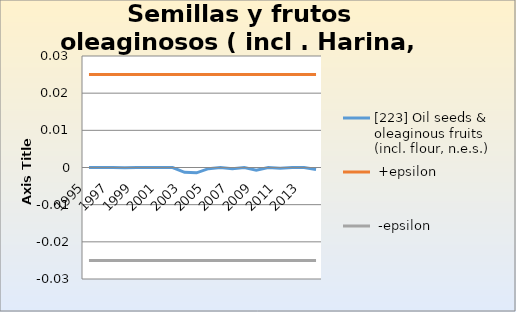
| Category | [223] Oil seeds & oleaginous fruits (incl. flour, n.e.s.) |  +epsilon |  -epsilon |
|---|---|---|---|
| 1995.0 | 0 | 0.025 | -0.025 |
| 1996.0 | 0 | 0.025 | -0.025 |
| 1997.0 | 0 | 0.025 | -0.025 |
| 1998.0 | 0 | 0.025 | -0.025 |
| 1999.0 | 0 | 0.025 | -0.025 |
| 2000.0 | 0 | 0.025 | -0.025 |
| 2001.0 | 0 | 0.025 | -0.025 |
| 2002.0 | 0 | 0.025 | -0.025 |
| 2003.0 | -0.001 | 0.025 | -0.025 |
| 2004.0 | -0.001 | 0.025 | -0.025 |
| 2005.0 | 0 | 0.025 | -0.025 |
| 2006.0 | 0 | 0.025 | -0.025 |
| 2007.0 | 0 | 0.025 | -0.025 |
| 2008.0 | 0 | 0.025 | -0.025 |
| 2009.0 | -0.001 | 0.025 | -0.025 |
| 2010.0 | 0 | 0.025 | -0.025 |
| 2011.0 | 0 | 0.025 | -0.025 |
| 2012.0 | 0 | 0.025 | -0.025 |
| 2013.0 | 0 | 0.025 | -0.025 |
| 2014.0 | -0.001 | 0.025 | -0.025 |